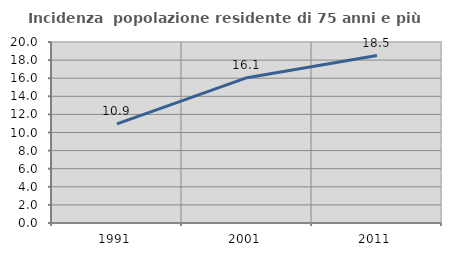
| Category | Incidenza  popolazione residente di 75 anni e più |
|---|---|
| 1991.0 | 10.949 |
| 2001.0 | 16.058 |
| 2011.0 | 18.502 |